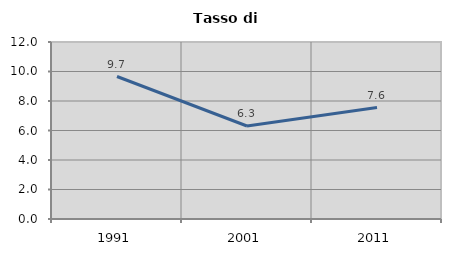
| Category | Tasso di disoccupazione   |
|---|---|
| 1991.0 | 9.661 |
| 2001.0 | 6.305 |
| 2011.0 | 7.558 |